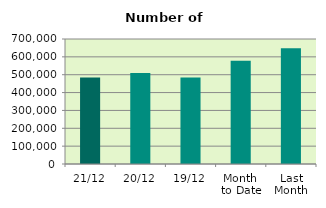
| Category | Series 0 |
|---|---|
| 21/12 | 484378 |
| 20/12 | 509228 |
| 19/12 | 484468 |
| Month 
to Date | 578551.867 |
| Last
Month | 647745.364 |